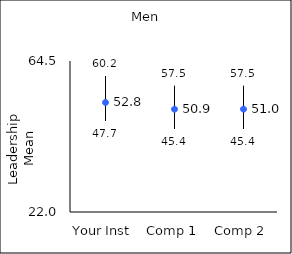
| Category | 25th percentile | 75th percentile | Mean |
|---|---|---|---|
| Your Inst | 47.7 | 60.2 | 52.82 |
| Comp 1 | 45.4 | 57.5 | 50.93 |
| Comp 2 | 45.4 | 57.5 | 50.95 |